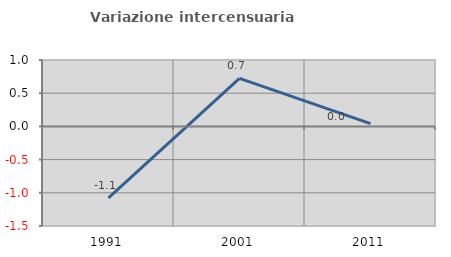
| Category | Variazione intercensuaria annua |
|---|---|
| 1991.0 | -1.078 |
| 2001.0 | 0.724 |
| 2011.0 | 0.041 |